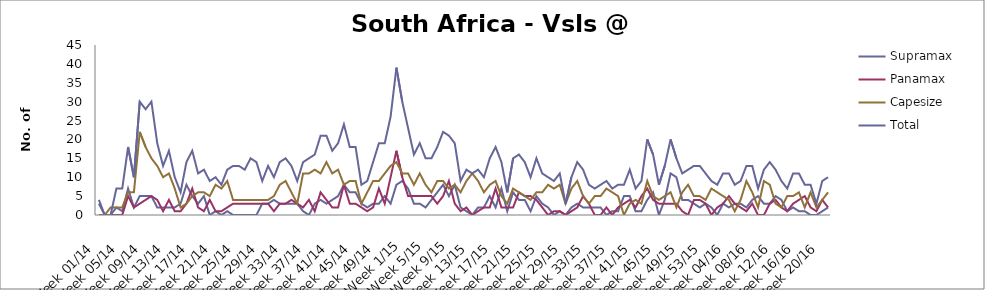
| Category | Supramax | Panamax | Capesize | Total |
|---|---|---|---|---|
| Week 01/14 | 3 | 0 | 0 | 4 |
| Week 02/14 | 0 | 0 | 0 | 0 |
| Week 03/14 | 0 | 0 | 2 | 0 |
| Week 04/14 | 2 | 0 | 2 | 7 |
| Week 05/14 | 1 | 0 | 2 | 7 |
| Week 06/14 | 7 | 5 | 6 | 18 |
| Week 07/14 | 2 | 2 | 6 | 10 |
| Week 08/14 | 5 | 3 | 22 | 30 |
| Week 09/14 | 5 | 4 | 18 | 28 |
| Week 10/14 | 5 | 5 | 15 | 30 |
| Week 11/14 | 2 | 4 | 13 | 19 |
| Week 12/14 | 2 | 1 | 10 | 13 |
| Week 13/14 | 2 | 4 | 11 | 17 |
| Week 14/14 | 2 | 1 | 7 | 10 |
| Week 15/14 | 3 | 1 | 2 | 6 |
| Week 16/14 | 8 | 3 | 3 | 14 |
| Week 17/14 | 5 | 7 | 5 | 17 |
| Week 18/14 | 3 | 2 | 6 | 11 |
| Week 19/14 | 5 | 1 | 6 | 12 |
| Week 20/14 | 0 | 4 | 5 | 9 |
| Week 21/14 | 1 | 1 | 8 | 10 |
| Week 22/14 | 0 | 1 | 7 | 8 |
| Week 23/14 | 1 | 2 | 9 | 12 |
| Week 24/14 | 0 | 3 | 4 | 13 |
| Week 25/14 | 0 | 3 | 4 | 13 |
| Week 26/14 | 0 | 3 | 4 | 12 |
| Week 27/14 | 0 | 3 | 4 | 15 |
| Week 28/14 | 0 | 3 | 4 | 14 |
| Week 29/14 | 3 | 3 | 4 | 9 |
| Week 30/14 | 3 | 3 | 4 | 13 |
| Week 31/14 | 4 | 1 | 5 | 10 |
| Week 32/14 | 3 | 3 | 8 | 14 |
| Week 33/14 | 3 | 3 | 9 | 15 |
| Week 34/14 | 3 | 4 | 6 | 13 |
| Week 35/14 | 3 | 3 | 3 | 9 |
| Week 36/14 | 1 | 2 | 11 | 14 |
| Week 37/14 | 0 | 4 | 11 | 15 |
| Week 38/14 | 3 | 1 | 12 | 16 |
| Week 39/14 | 4 | 6 | 11 | 21 |
| Week 40/14 | 3 | 4 | 14 | 21 |
| Week 41/14 | 4 | 2 | 11 | 17 |
| Week 42/14 | 5 | 2 | 12 | 19 |
| Week 43/14 | 8 | 8 | 8 | 24 |
| Week 44/14 | 6 | 3 | 9 | 18 |
| Week 45/14 | 6 | 3 | 9 | 18 |
| Week 46/14 | 3 | 2 | 3 | 8 |
| Week 47/14 | 2 | 1 | 6 | 9 |
| Week 48/14 | 3 | 2 | 9 | 14 |
| Week 49/14 | 3 | 7 | 9 | 19 |
| Week 50/14 | 5 | 3 | 11 | 19 |
| Week 51/14 | 3 | 10 | 13 | 26 |
| Week 52/14 | 8 | 17 | 14 | 39 |
| Week 1/15 | 9 | 10 | 11 | 30 |
| Week 2/15 | 7 | 5 | 11 | 23 |
| Week 3/15 | 3 | 5 | 8 | 16 |
| Week 4/15 | 3 | 5 | 11 | 19 |
| Week 5/15 | 2 | 5 | 8 | 15 |
| Week 6/15 | 4 | 5 | 6 | 15 |
| Week 7/15 | 6 | 3 | 9 | 18 |
| Week 8/15 | 8 | 5 | 9 | 22 |
| Week 9/15 | 5 | 9 | 7 | 21 |
| Week 10/15 | 8 | 3 | 8 | 19 |
| Week 11/15 | 2 | 1 | 6 | 9 |
| Week 12/15 | 1 | 2 | 9 | 12 |
| Week 13/15 | 0 | 0 | 11 | 11 |
| Week 14/15 | 2 | 1 | 9 | 12 |
| Week 15/15 | 2 | 2 | 6 | 10 |
| Week 16/15 | 5 | 2 | 8 | 15 |
| Week 17/15 | 2 | 7 | 9 | 18 |
| Week 18/15 | 7 | 2 | 5 | 14 |
| Week 19/15 | 1 | 2 | 3 | 6 |
| Week 20/15 | 6 | 2 | 7 | 15 |
| Week 21/15 | 4 | 6 | 6 | 16 |
| Week 22/15 | 4 | 5 | 5 | 14 |
| Week 23/15 | 1 | 5 | 4 | 10 |
| Week 24/15 | 5 | 4 | 6 | 15 |
| Week 25/15 | 3 | 2 | 6 | 11 |
| Week 26/15 | 2 | 0 | 8 | 10 |
| Week 27/15 | 0 | 1 | 7 | 9 |
| Week 28/15 | 1 | 1 | 8 | 11 |
| Week 29/15 | 0 | 0 | 3 | 3 |
| Week 30/15 | 2 | 1 | 7 | 10 |
| Week 31/15 | 3 | 2 | 9 | 14 |
| Week 32/15 | 2 | 5 | 5 | 12 |
| Week 33/15 | 2 | 3 | 3 | 8 |
| Week 34/15 | 2 | 0 | 5 | 7 |
| Week 35/15 | 2 | 0 | 5 | 8 |
| Week 36/15 | 0 | 2 | 7 | 9 |
| Week 37/15 | 1 | 0 | 6 | 7 |
| Week 38/15 | 1 | 2 | 5 | 8 |
| Week 39/15 | 5 | 3 | 0 | 8 |
| Week 40/15 | 5 | 4 | 3 | 12 |
| Week 41/15 | 1 | 2 | 4 | 7 |
| Week 42/15 | 1 | 5 | 3 | 9 |
| Week 43/15 | 4 | 7 | 9 | 20 |
| Week 44/15 | 6 | 4 | 5 | 16 |
| Week 45/15 | 0 | 3 | 4 | 8 |
| Week 46/15 | 4 | 3 | 5 | 13 |
| Week 47/15 | 11 | 3 | 6 | 20 |
| Week 48/15 | 10 | 3 | 2 | 15 |
| Week 49/15 | 4 | 1 | 6 | 11 |
| Week 50/15 | 4 | 0 | 8 | 12 |
| Week 51/15 | 3 | 4 | 5 | 13 |
| Week 52/15 | 2 | 4 | 5 | 13 |
| Week 53/15 | 3 | 3 | 4 | 11 |
| Week 01/16 | 2 | 0 | 7 | 9 |
| Week 02/16 | 0 | 2 | 6 | 8 |
| Week 03/16 | 3 | 3 | 5 | 11 |
| Week 04/16 | 2 | 5 | 4 | 11 |
| Week 05/16 | 3 | 3 | 1 | 8 |
| Week 06/16 | 3 | 2 | 4 | 9 |
| Week 07/16 | 2 | 1 | 9 | 13 |
| Week 08/16 | 4 | 3 | 6 | 13 |
| Week 09/16 | 5 | 0 | 2 | 7 |
| Week 10/16 | 3 | 0 | 9 | 12 |
| Week 11/16 | 3 | 3 | 8 | 14 |
| Week 12/16 | 5 | 4 | 3 | 12 |
| Week 13/16 | 4 | 2 | 2 | 9 |
| Week 14/16 | 1 | 1 | 5 | 7 |
| Week 15/16 | 2 | 3 | 5 | 11 |
| Week 16/16 | 1 | 4 | 6 | 11 |
| Week 17/16 | 1 | 5 | 2 | 8 |
| Week 18/16 | 0 | 2 | 6 | 8 |
| Week 19/16 | 0 | 1 | 2 | 3 |
| Week 20/16 | 1 | 4 | 4 | 9 |
| Week 21/16 | 2 | 2 | 6 | 10 |